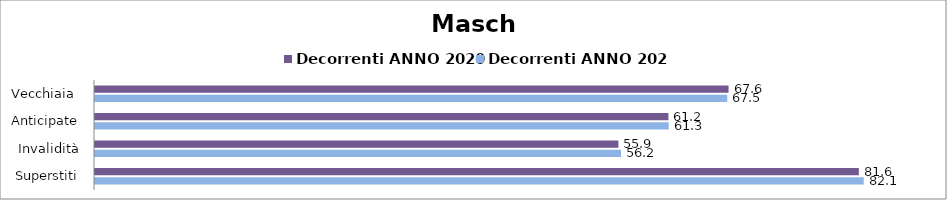
| Category | Decorrenti ANNO 2020 | Decorrenti ANNO 2021 |
|---|---|---|
| Vecchiaia  | 67.64 | 67.5 |
| Anticipate | 61.22 | 61.25 |
| Invalidità | 55.88 | 56.16 |
| Superstiti | 81.55 | 82.07 |